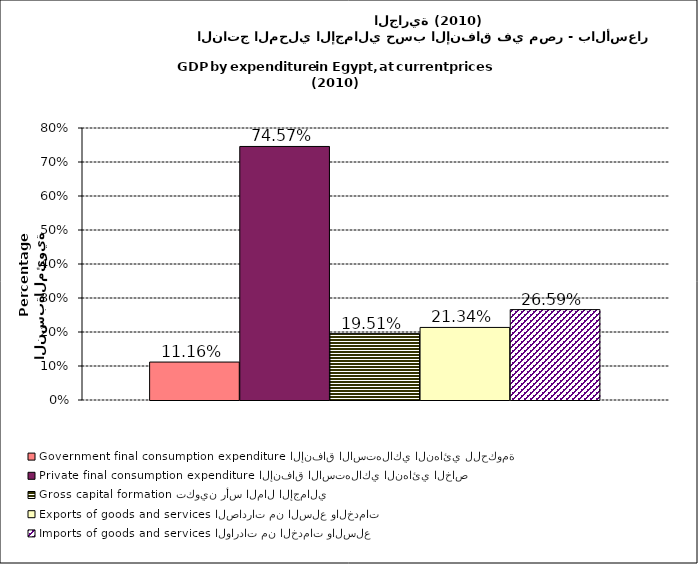
| Category | Government final consumption expenditure الإنفاق الاستهلاكي النهائي للحكومة | Private final consumption expenditure الإنفاق الاستهلاكي النهائي الخاص | Gross capital formation تكوين رأس المال الإجمالي | Exports of goods and services الصادرات من السلع والخدمات | Imports of goods and services الواردات من الخدمات والسلع |
|---|---|---|---|---|---|
| 0 | 0.112 | 0.746 | 0.195 | 0.213 | 0.266 |